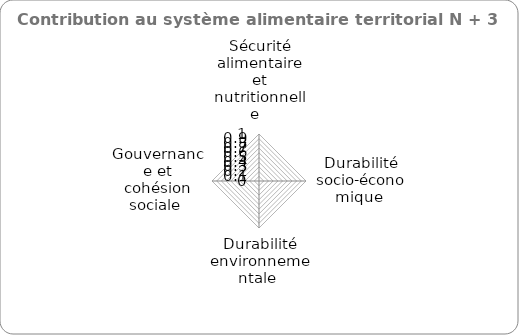
| Category | Series 0 |
|---|---|
| Sécurité alimentaire et nutritionnelle   | 0 |
| Durabilité socio-économique  | 0 |
| Durabilité environnementale  | 0 |
| Gouvernance et cohésion sociale  | 0 |